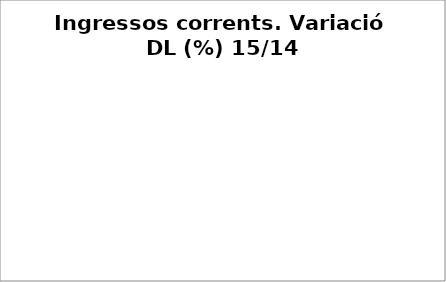
| Category | Series 0 |
|---|---|
| Impostos locals | 0.061 |
| Participació Tributs de l'Estat | 0.065 |
| Taxes i altres ingressos | -0.046 |
| Transferències corrents (exc. FCF) | 0.062 |
| Ingressos patrimonials | 0.775 |
| Ingressos corrents | 0.058 |